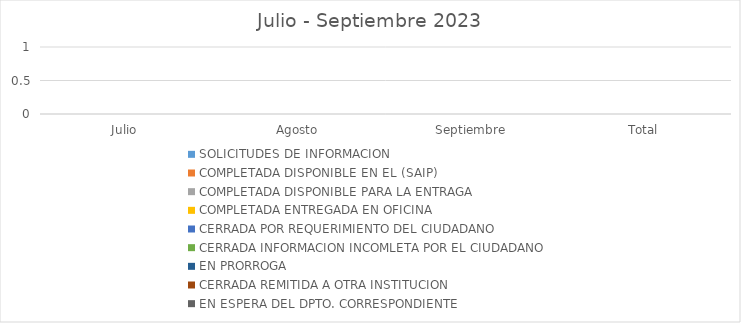
| Category | SOLICITUDES DE INFORMACION | COMPLETADA DISPONIBLE EN EL (SAIP) | COMPLETADA DISPONIBLE PARA LA ENTRAGA | COMPLETADA ENTREGADA EN OFICINA | CERRADA POR REQUERIMIENTO DEL CIUDADANO | CERRADA INFORMACION INCOMLETA POR EL CIUDADANO | EN PRORROGA | CERRADA REMITIDA A OTRA INSTITUCION | EN ESPERA DEL DPTO. CORRESPONDIENTE |
|---|---|---|---|---|---|---|---|---|---|
| Julio | 0 | 0 | 0 | 0 | 0 | 0 | 0 | 0 | 0 |
| Agosto | 0 | 0 | 0 | 0 | 0 | 0 | 0 | 0 | 0 |
| Septiembre | 0 | 0 | 0 | 0 | 0 | 0 | 0 | 0 | 0 |
| Total | 0 | 0 | 0 | 0 | 0 | 0 | 0 | 0 | 0 |